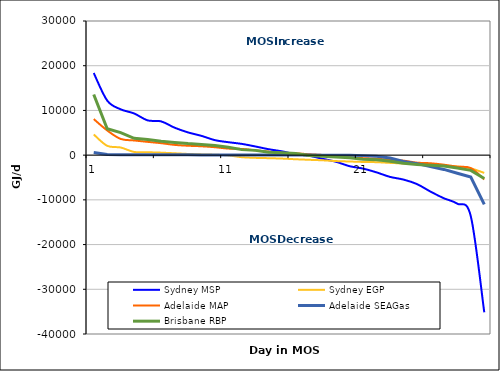
| Category | Sydney MSP | Sydney EGP | Adelaide MAP | Adelaide SEAGas | Brisbane RBP |
|---|---|---|---|---|---|
| 0 | 18367 | 4625.392 | 8070 | 584 | 13575 |
| 1 | 12206 | 2084.029 | 5521 | 169 | 5902 |
| 2 | 10250 | 1711.707 | 3624 | 106 | 5037 |
| 3 | 9323 | 712.927 | 3283 | 96 | 3775 |
| 4 | 7775 | 652.108 | 2972 | 80 | 3515 |
| 5 | 7554 | 558.702 | 2676 | 76 | 3130 |
| 6 | 6149 | 416.111 | 2296 | 70 | 2843 |
| 7 | 5085 | 267.989 | 2102 | 63 | 2580 |
| 8 | 4310 | 170.688 | 1984 | 56 | 2403 |
| 9 | 3351 | 95.622 | 1773 | 51 | 2160 |
| 10 | 2892 | -62.141 | 1462 | 43 | 1787 |
| 11 | 2515 | -458.462 | 1383 | 40 | 1233 |
| 12 | 1940 | -606.263 | 1078 | 36 | 1066 |
| 13 | 1319 | -680.501 | 786 | 31 | 671 |
| 14 | 838 | -771.638 | 486 | 22 | 556 |
| 15 | 182 | -920.849 | 408 | 14 | 359 |
| 16 | -144 | -1044.16 | 197 | 4 | -69 |
| 17 | -820 | -1154.744 | 42 | 0 | -230 |
| 18 | -1486 | -1327.882 | -222 | -3 | -390 |
| 19 | -2475 | -1420.451 | -466 | -4 | -566 |
| 20 | -3009 | -1523.574 | -672 | -108 | -916 |
| 21 | -3854 | -1573.009 | -789 | -255 | -1057 |
| 22 | -4864 | -1730.381 | -1060 | -638 | -1388 |
| 23 | -5464 | -1861.9 | -1233 | -1410 | -1803 |
| 24 | -6464 | -1958.664 | -1681 | -1894 | -2083 |
| 25 | -8139 | -2148 | -1813 | -2562 | -2286 |
| 26 | -9644 | -2412.283 | -2132 | -3195 | -2450 |
| 27 | -10857 | -2537.133 | -2577 | -4064 | -2876 |
| 28 | -13663 | -2963.787 | -2889 | -4895 | -3409 |
| 29 | -35148 | -3973.468 | -5440 | -11001 | -5206 |